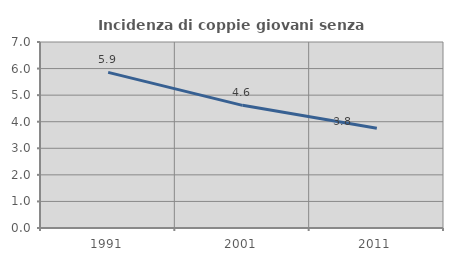
| Category | Incidenza di coppie giovani senza figli |
|---|---|
| 1991.0 | 5.857 |
| 2001.0 | 4.616 |
| 2011.0 | 3.752 |